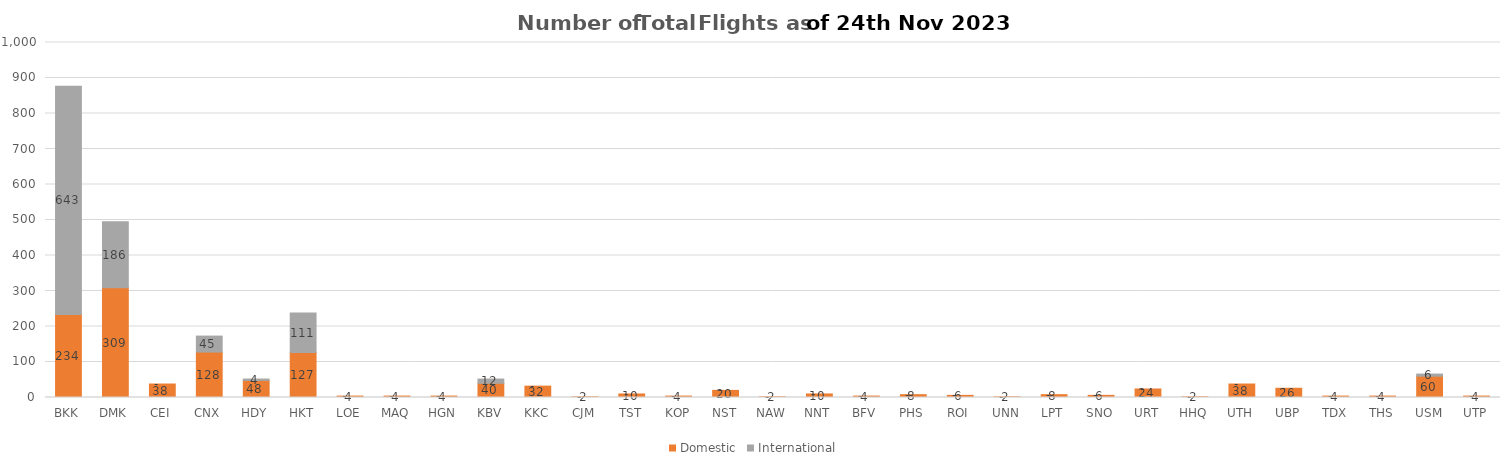
| Category | Domestic | International |
|---|---|---|
| BKK | 234 | 643 |
| DMK | 309 | 186 |
| CEI | 38 | 0 |
| CNX | 128 | 45 |
| HDY | 48 | 4 |
| HKT | 127 | 111 |
| LOE | 4 | 0 |
| MAQ | 4 | 0 |
| HGN | 4 | 0 |
| KBV | 40 | 12 |
| KKC | 32 | 0 |
| CJM | 2 | 0 |
| TST | 10 | 0 |
| KOP | 4 | 0 |
| NST | 20 | 0 |
| NAW | 2 | 0 |
| NNT | 10 | 0 |
| BFV | 4 | 0 |
| PHS | 8 | 0 |
| ROI | 6 | 0 |
| UNN | 2 | 0 |
| LPT | 8 | 0 |
| SNO | 6 | 0 |
| URT | 24 | 0 |
| HHQ | 2 | 0 |
| UTH | 38 | 0 |
| UBP | 26 | 0 |
| TDX | 4 | 0 |
| THS | 4 | 0 |
| USM | 60 | 6 |
| UTP | 4 | 0 |